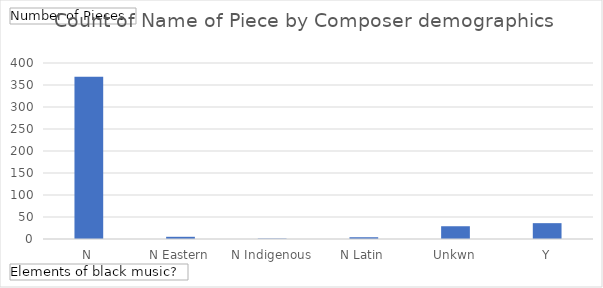
| Category | Total |
|---|---|
| N | 369 |
| N Eastern | 5 |
| N Indigenous | 1 |
| N Latin | 4 |
| Unkwn | 29 |
| Y | 36 |